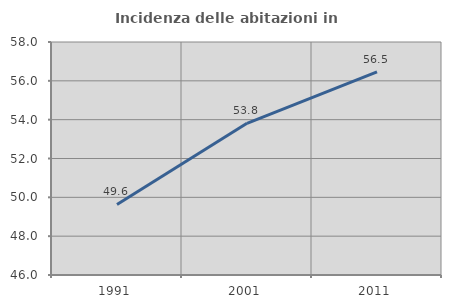
| Category | Incidenza delle abitazioni in proprietà  |
|---|---|
| 1991.0 | 49.632 |
| 2001.0 | 53.814 |
| 2011.0 | 56.463 |